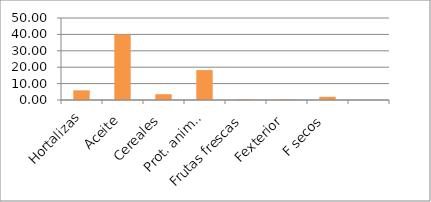
| Category | Series 0 |
|---|---|
| Hortalizas | 5.904 |
| Aceite | 39.96 |
| Cereales | 3.533 |
| Prot. animal | 18.23 |
| Frutas frescas | 0.402 |
| Fexterior | 0.402 |
|      F secos | 1.96 |